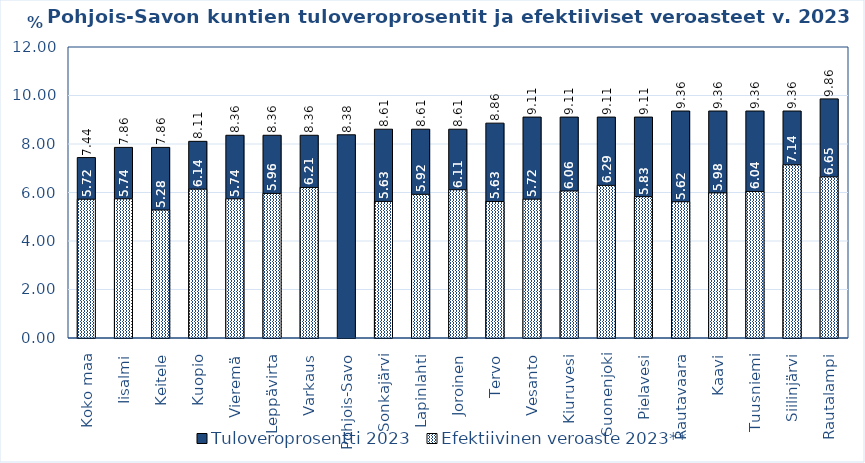
| Category | Tuloveroprosentti 2023 | Efektiivinen veroaste 2023** |
|---|---|---|
| Koko maa | 7.44 | 5.722 |
| Iisalmi | 7.86 | 5.74 |
| Keitele | 7.86 | 5.277 |
| Kuopio | 8.11 | 6.139 |
| Vieremä | 8.36 | 5.74 |
| Leppävirta | 8.36 | 5.963 |
| Varkaus | 8.36 | 6.208 |
| Pohjois-Savo | 8.38 | 0 |
| Sonkajärvi | 8.61 | 5.633 |
| Lapinlahti | 8.61 | 5.924 |
| Joroinen | 8.61 | 6.114 |
| Tervo | 8.86 | 5.63 |
| Vesanto | 9.11 | 5.725 |
| Kiuruvesi | 9.11 | 6.063 |
| Suonenjoki | 9.11 | 6.294 |
| Pielavesi | 9.11 | 5.828 |
| Rautavaara | 9.36 | 5.619 |
| Kaavi | 9.36 | 5.984 |
| Tuusniemi | 9.36 | 6.043 |
| Siilinjärvi | 9.36 | 7.143 |
| Rautalampi | 9.86 | 6.646 |